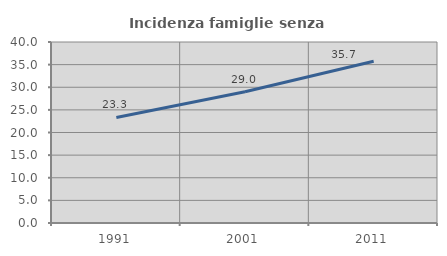
| Category | Incidenza famiglie senza nuclei |
|---|---|
| 1991.0 | 23.317 |
| 2001.0 | 28.998 |
| 2011.0 | 35.742 |